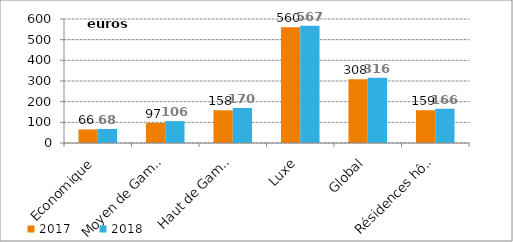
| Category | 2017 | 2018 |
|---|---|---|
| Economique | 65.657 | 67.631 |
| Moyen de Gamme | 97.197 | 105.96 |
| Haut de Gamme | 158.053 | 169.591 |
| Luxe | 560.368 | 567.276 |
| Global | 308.04 | 315.664 |
| Résidences hôtelières | 158.539 | 165.887 |